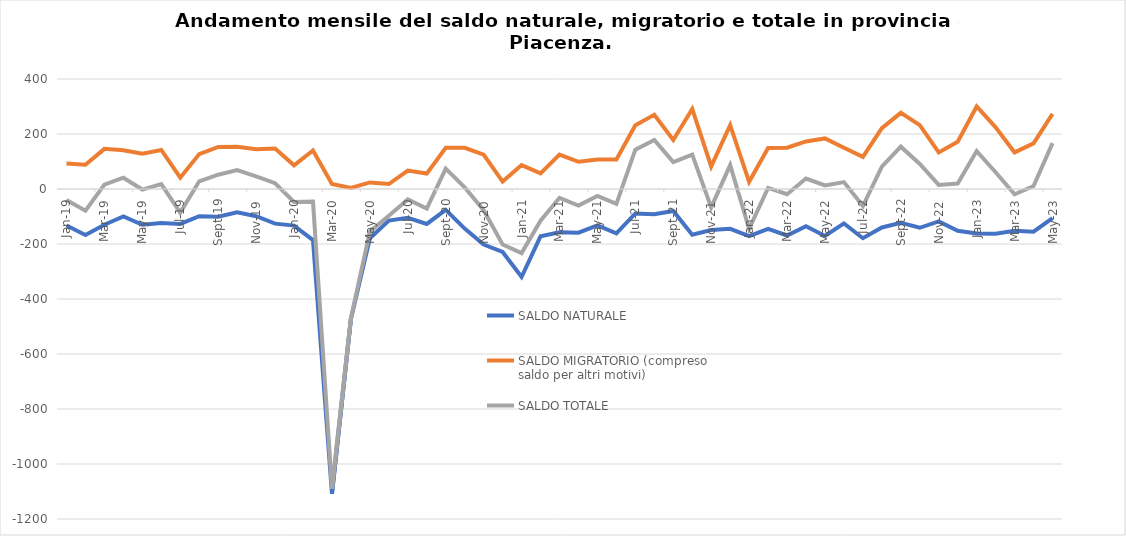
| Category | SALDO NATURALE | SALDO MIGRATORIO (compreso saldo per altri motivi) | SALDO TOTALE |
|---|---|---|---|
| 2019-01-01 | -133 | 93 | -40 |
| 2019-02-01 | -167 | 88 | -79 |
| 2019-03-01 | -130 | 146 | 16 |
| 2019-04-01 | -100 | 141 | 41 |
| 2019-05-01 | -130 | 128 | -2 |
| 2019-06-01 | -124 | 142 | 18 |
| 2019-07-01 | -127 | 41 | -86 |
| 2019-08-01 | -99 | 127 | 28 |
| 2019-09-01 | -101 | 153 | 52 |
| 2019-10-01 | -85 | 154 | 69 |
| 2019-11-01 | -99 | 145 | 46 |
| 2019-12-01 | -126 | 147 | 21 |
| 2020-01-01 | -133 | 86 | -47 |
| 2020-02-01 | -186 | 140 | -46 |
| 2020-03-01 | -1108 | 18 | -1090 |
| 2020-04-01 | -473 | 4 | -469 |
| 2020-05-01 | -179 | 24 | -155 |
| 2020-06-01 | -115 | 18 | -97 |
| 2020-07-01 | -105 | 67 | -38 |
| 2020-08-01 | -127 | 56 | -71 |
| 2020-09-01 | -76 | 150 | 74 |
| 2020-10-01 | -144 | 150 | 6 |
| 2020-11-01 | -202 | 125 | -77 |
| 2020-12-01 | -229 | 27 | -202 |
| 2021-01-01 | -320 | 87 | -233 |
| 2021-02-01 | -172 | 57 | -115 |
| 2021-03-01 | -157 | 125 | -32 |
| 2021-04-01 | -159 | 99 | -60 |
| 2021-05-01 | -132 | 107 | -25 |
| 2021-06-01 | -161 | 107 | -54 |
| 2021-07-01 | -89 | 232 | 143 |
| 2021-08-01 | -92 | 270 | 178 |
| 2021-09-01 | -80 | 178 | 98 |
| 2021-10-01 | -166 | 291 | 125 |
| 2021-11-01 | -149 | 82 | -67 |
| 2021-12-01 | -145 | 232 | 87 |
| 2022-01-01 | -171 | 26 | -145 |
| 2022-02-01 | -145 | 149 | 4 |
| 2022-03-01 | -169 | 150 | -19 |
| 2022-04-01 | -135 | 173 | 38 |
| 2022-05-01 | -171 | 184 | 13 |
| 2022-06-01 | -125 | 150 | 25 |
| 2022-07-01 | -179 | 117 | -62 |
| 2022-08-01 | -140 | 221 | 81 |
| 2022-09-01 | -123 | 277 | 154 |
| 2022-10-01 | -141 | 232 | 91 |
| 2022-11-01 | -118 | 133 | 15 |
| 2022-12-01 | -152 | 172 | 20 |
| 2023-01-01 | -162 | 300 | 138 |
| 2023-02-01 | -163 | 224 | 61 |
| 2023-03-01 | -152 | 133 | -19 |
| 2023-04-01 | -155 | 166 | 11 |
| 2023-05-01 | -106 | 273 | 167 |